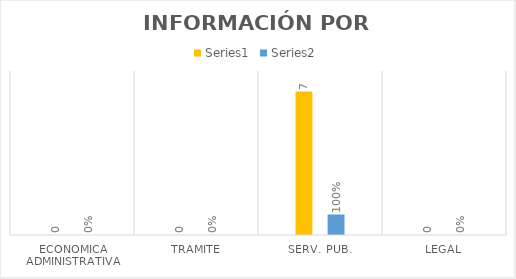
| Category | Series 3 | Series 4 |
|---|---|---|
| ECONOMICA ADMINISTRATIVA | 0 | 0 |
| TRAMITE | 0 | 0 |
| SERV. PUB. | 7 | 1 |
| LEGAL | 0 | 0 |